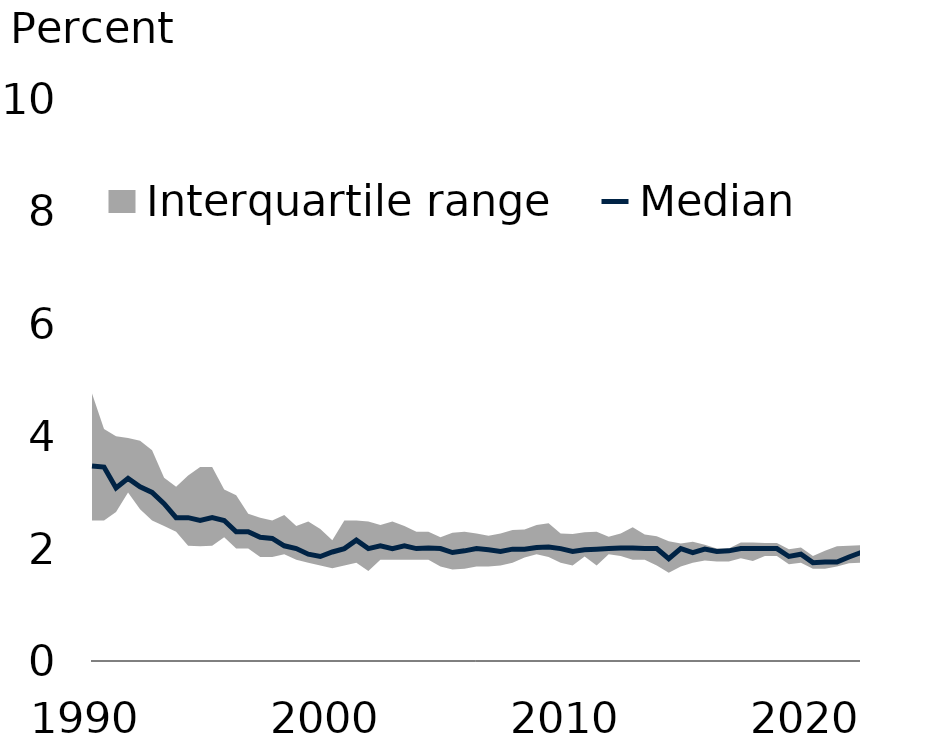
| Category | Median |
|---|---|
| 1990.0 | 3.47 |
| nan | 3.45 |
| nan | 3.08 |
| nan | 3.25 |
| nan | 3.1 |
| nan | 3 |
| nan | 2.8 |
| nan | 2.55 |
| nan | 2.55 |
| nan | 2.5 |
| 1995.0 | 2.55 |
| nan | 2.5 |
| nan | 2.3 |
| nan | 2.3 |
| nan | 2.2 |
| nan | 2.18 |
| nan | 2.05 |
| nan | 2 |
| nan | 1.9 |
| nan | 1.86 |
| 2000.0 | 1.94 |
| nan | 2 |
| nan | 2.15 |
| nan | 2 |
| nan | 2.05 |
| nan | 2 |
| nan | 2.05 |
| nan | 2 |
| nan | 2.01 |
| nan | 2 |
| 2005.0 | 1.93 |
| nan | 1.96 |
| nan | 2 |
| nan | 1.98 |
| nan | 1.95 |
| nan | 1.99 |
| nan | 1.99 |
| nan | 2.02 |
| nan | 2.03 |
| nan | 2 |
| 2010.0 | 1.95 |
| nan | 1.98 |
| nan | 1.99 |
| nan | 2 |
| nan | 2.01 |
| nan | 2.01 |
| nan | 2 |
| nan | 2 |
| nan | 1.82 |
| nan | 2 |
| 2015.0 | 1.93 |
| nan | 1.99 |
| nan | 1.95 |
| nan | 1.96 |
| nan | 2 |
| nan | 2 |
| nan | 2 |
| nan | 2 |
| nan | 1.86 |
| nan | 1.9 |
| 2020.0 | 1.75 |
| 2020.0 | 1.76 |
| 2021.0 | 1.76 |
| 2021.0 | 1.85 |